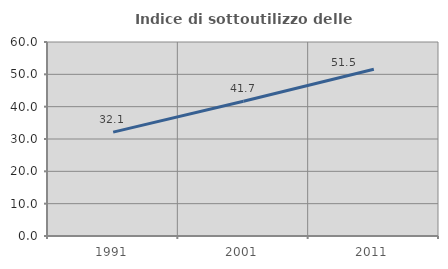
| Category | Indice di sottoutilizzo delle abitazioni  |
|---|---|
| 1991.0 | 32.127 |
| 2001.0 | 41.689 |
| 2011.0 | 51.549 |